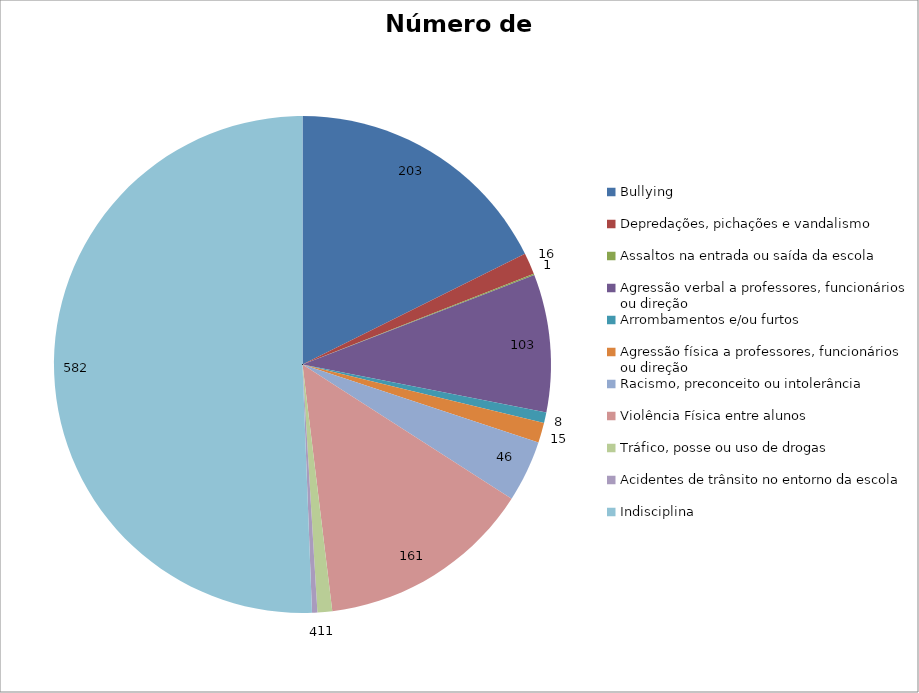
| Category | Número de Casos |
|---|---|
| Bullying | 203 |
| Depredações, pichações e vandalismo | 16 |
| Assaltos na entrada ou saída da escola | 1 |
| Agressão verbal a professores, funcionários ou direção | 103 |
| Arrombamentos e/ou furtos | 8 |
| Agressão física a professores, funcionários ou direção | 15 |
| Racismo, preconceito ou intolerância | 46 |
| Violência Física entre alunos | 161 |
| Tráfico, posse ou uso de drogas | 11 |
| Acidentes de trânsito no entorno da escola | 4 |
| Indisciplina | 582 |